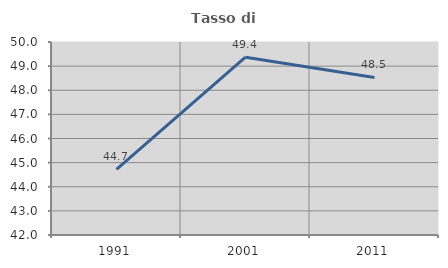
| Category | Tasso di occupazione   |
|---|---|
| 1991.0 | 44.718 |
| 2001.0 | 49.368 |
| 2011.0 | 48.531 |